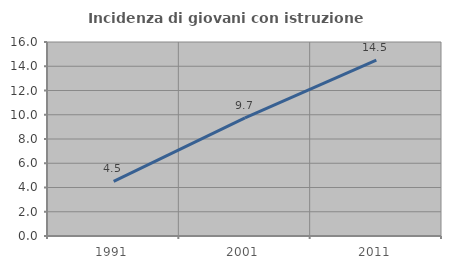
| Category | Incidenza di giovani con istruzione universitaria |
|---|---|
| 1991.0 | 4.5 |
| 2001.0 | 9.746 |
| 2011.0 | 14.5 |